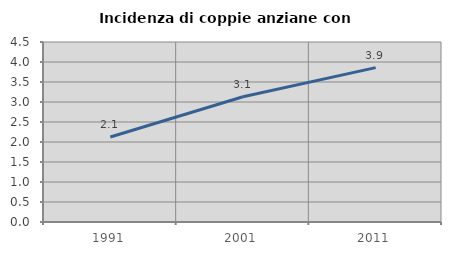
| Category | Incidenza di coppie anziane con figli |
|---|---|
| 1991.0 | 2.126 |
| 2001.0 | 3.13 |
| 2011.0 | 3.86 |